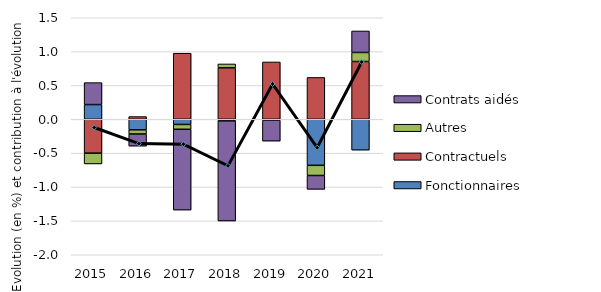
| Category | Fonctionnaires | Contractuels | Autres | Contrats aidés |
|---|---|---|---|---|
| 2015.0 | 0.218 | -0.5 | -0.159 | 0.324 |
| 2016.0 | -0.155 | 0.041 | -0.062 | -0.179 |
| 2017.0 | -0.076 | 0.977 | -0.071 | -1.193 |
| 2018.0 | -0.022 | 0.761 | 0.057 | -1.479 |
| 2019.0 | -0.002 | 0.847 | -0.009 | -0.31 |
| 2020.0 | -0.679 | 0.619 | -0.15 | -0.205 |
| 2021.0 | -0.455 | 0.854 | 0.134 | 0.318 |